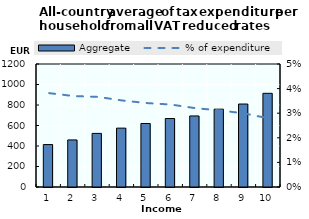
| Category | Aggregate |
|---|---|
| 0 | 414.154 |
| 1 | 459.209 |
| 2 | 522.873 |
| 3 | 574.273 |
| 4 | 619.49 |
| 5 | 667.901 |
| 6 | 693.15 |
| 7 | 759.373 |
| 8 | 809.591 |
| 9 | 913.896 |